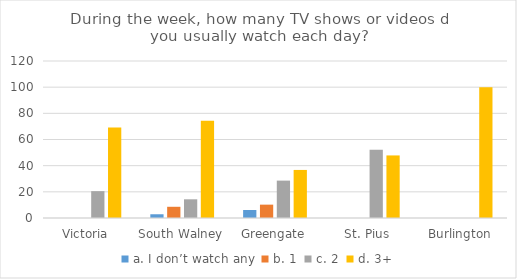
| Category | a. | b. | c. | d. |
|---|---|---|---|---|
| Victoria  | 0 | 0 | 20.513 | 69.231 |
| South Walney | 2.857 | 8.571 | 14.286 | 74.286 |
| Greengate | 6.122 | 10.204 | 28.571 | 36.735 |
| St. Pius | 0 | 0 | 52.174 | 47.826 |
| Burlington | 0 | 0 | 0 | 100 |